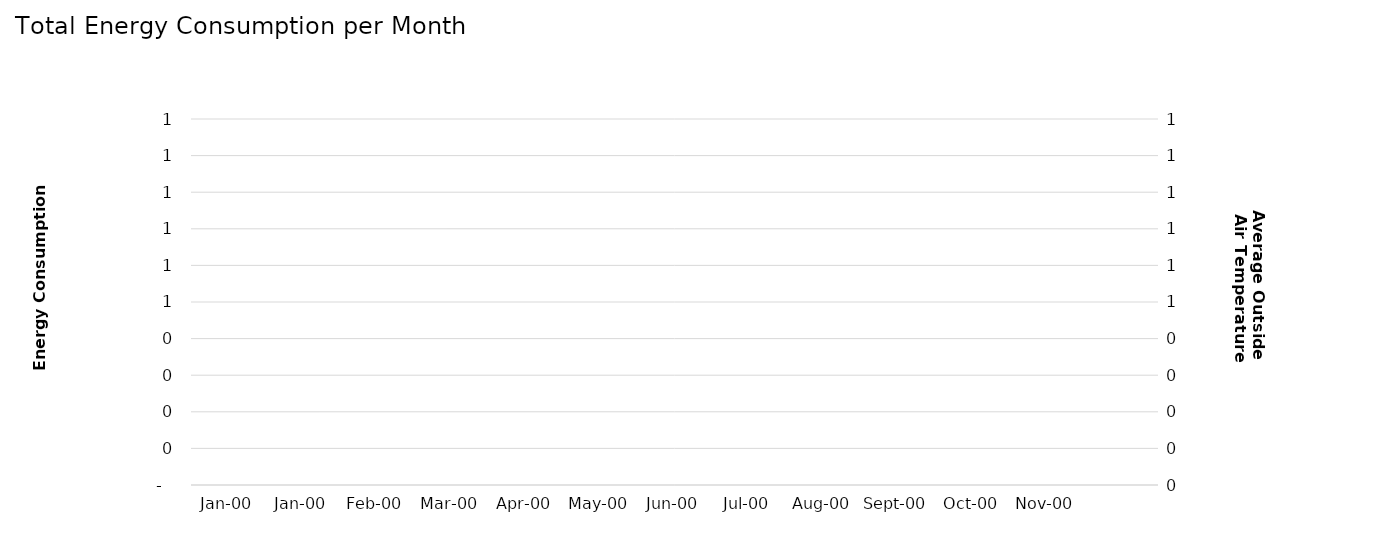
| Category | Series 0 |
|---|---|
| 0.0 | 0 |
| 1900-02-01 | 0 |
| 1900-03-01 | 0 |
| 1900-04-01 | 0 |
| 1900-05-01 | 0 |
| 1900-06-01 | 0 |
| 1900-07-01 | 0 |
| 1900-08-01 | 0 |
| 1900-09-01 | 0 |
| 1900-10-01 | 0 |
| 1900-11-01 | 0 |
| 1900-12-01 | 0 |